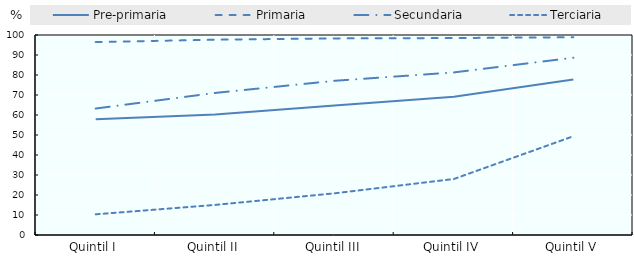
| Category | Pre-primaria | Primaria | Secundaria | Terciaria |
|---|---|---|---|---|
| Quintil I | 57.899 | 96.444 | 63.235 | 10.344 |
| Quintil II | 60.295 | 97.659 | 71.032 | 15.044 |
| Quintil III | 64.746 | 98.299 | 77.098 | 20.835 |
| Quintil IV | 69.07 | 98.483 | 81.295 | 28.01 |
| Quintil V | 77.751 | 98.879 | 88.634 | 49.376 |